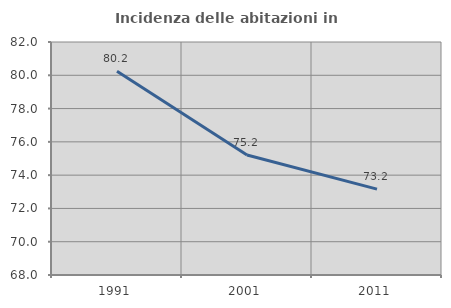
| Category | Incidenza delle abitazioni in proprietà  |
|---|---|
| 1991.0 | 80.241 |
| 2001.0 | 75.213 |
| 2011.0 | 73.157 |